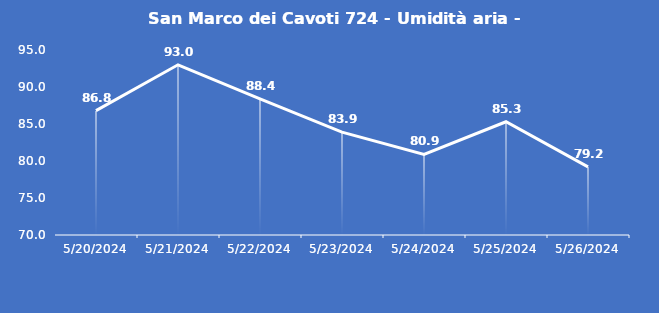
| Category | San Marco dei Cavoti 724 - Umidità aria - Grezzo (%) |
|---|---|
| 5/20/24 | 86.8 |
| 5/21/24 | 93 |
| 5/22/24 | 88.4 |
| 5/23/24 | 83.9 |
| 5/24/24 | 80.9 |
| 5/25/24 | 85.3 |
| 5/26/24 | 79.2 |